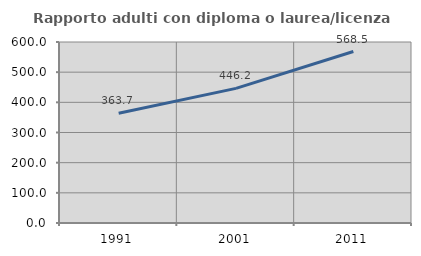
| Category | Rapporto adulti con diploma o laurea/licenza media  |
|---|---|
| 1991.0 | 363.735 |
| 2001.0 | 446.196 |
| 2011.0 | 568.471 |